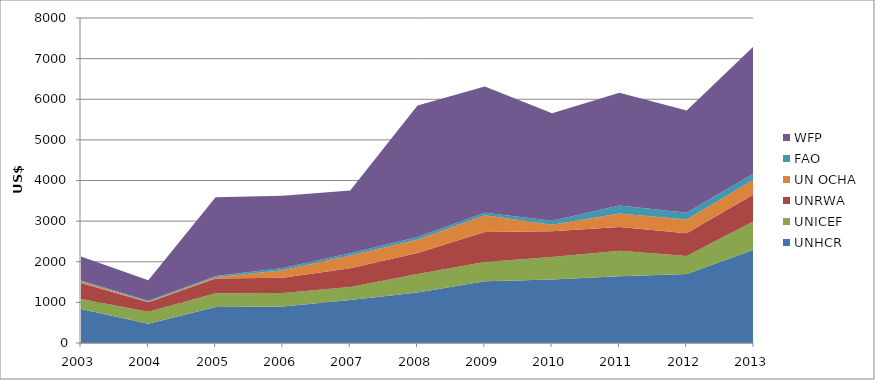
| Category | UNHCR | UNICEF | UNRWA | UN OCHA | FAO | WFP |
|---|---|---|---|---|---|---|
| 2003.0 | 837.311 | 248.443 | 392.145 | 37.984 | 22.973 | 592.499 |
| 2004.0 | 471.361 | 298.996 | 232.452 | 15.311 | 24.579 | 500.094 |
| 2005.0 | 883.583 | 338.725 | 362.594 | 36.425 | 26.926 | 1939.205 |
| 2006.0 | 899.687 | 330.32 | 373.147 | 186.143 | 54.94 | 1778.736 |
| 2007.0 | 1058.555 | 317.632 | 461.823 | 314.552 | 53.596 | 1547.967 |
| 2008.0 | 1241.028 | 460.439 | 516.567 | 323.388 | 68.124 | 3236.658 |
| 2009.0 | 1519.02 | 477.76 | 735.286 | 413.45 | 61.733 | 3107.94 |
| 2010.0 | 1562.237 | 552.532 | 634.337 | 162.697 | 95.494 | 2646.719 |
| 2011.0 | 1642.189 | 630.997 | 579.406 | 332.514 | 199.28 | 2777.253 |
| 2012.0 | 1698.432 | 445.128 | 560.595 | 337.349 | 166.451 | 2517.188 |
| 2013.0 | 2299.287 | 703.369 | 659.811 | 367.509 | 149.295 | 3128.268 |